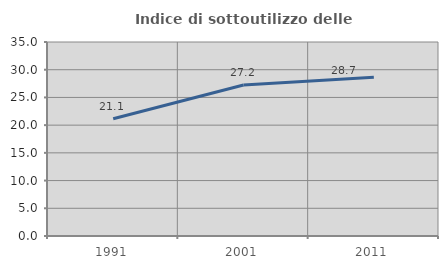
| Category | Indice di sottoutilizzo delle abitazioni  |
|---|---|
| 1991.0 | 21.142 |
| 2001.0 | 27.233 |
| 2011.0 | 28.657 |